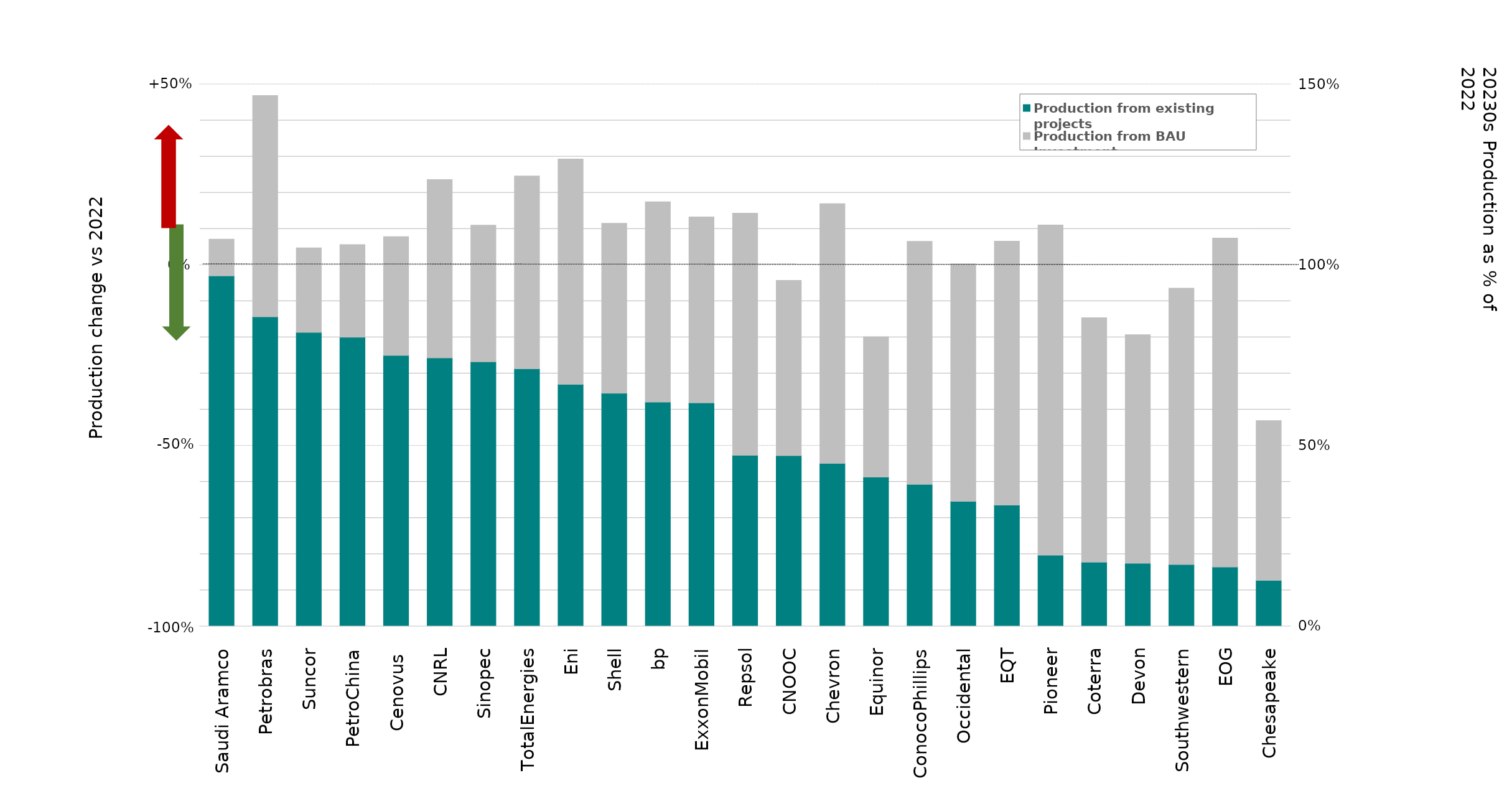
| Category | Production from existing projects | Production from BAU Investment |
|---|---|---|
| Saudi Aramco | 0.97 | 0.102 |
| Petrobras | 0.857 | 0.612 |
| Suncor | 0.814 | 0.234 |
| PetroChina | 0.8 | 0.256 |
| Cenovus  | 0.75 | 0.328 |
| CNRL | 0.743 | 0.493 |
| Sinopec | 0.733 | 0.378 |
| TotalEnergies | 0.713 | 0.534 |
| Eni | 0.67 | 0.624 |
| Shell | 0.645 | 0.471 |
| bp | 0.621 | 0.554 |
| ExxonMobil | 0.619 | 0.515 |
| Repsol | 0.474 | 0.67 |
| CNOOC | 0.473 | 0.484 |
| Chevron | 0.451 | 0.718 |
| Equinor | 0.413 | 0.388 |
| ConocoPhillips | 0.393 | 0.673 |
| Occidental | 0.346 | 0.657 |
| EQT | 0.336 | 0.73 |
| Pioneer | 0.197 | 0.914 |
| Coterra | 0.178 | 0.677 |
| Devon | 0.175 | 0.632 |
| Southwestern | 0.171 | 0.765 |
| EOG | 0.164 | 0.91 |
| Chesapeake | 0.127 | 0.442 |